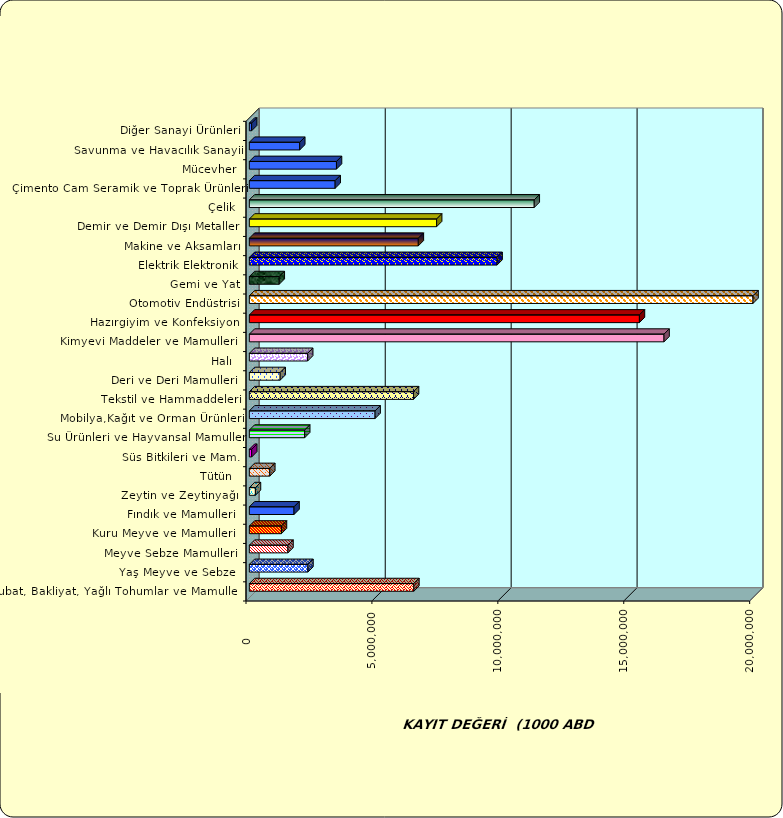
| Category | Series 0 |
|---|---|
|  Hububat, Bakliyat, Yağlı Tohumlar ve Mamulleri  | 6532204.22 |
|  Yaş Meyve ve Sebze   | 2326231.497 |
|  Meyve Sebze Mamulleri  | 1532795.071 |
|  Kuru Meyve ve Mamulleri   | 1273789.65 |
|  Fındık ve Mamulleri  | 1774006.961 |
|  Zeytin ve Zeytinyağı  | 241037.009 |
|  Tütün  | 810747.842 |
|  Süs Bitkileri ve Mam. | 93007.603 |
|  Su Ürünleri ve Hayvansal Mamuller | 2196996.661 |
|  Mobilya,Kağıt ve Orman Ürünleri | 4992845.582 |
|  Tekstil ve Hammaddeleri | 6518454.696 |
|  Deri ve Deri Mamulleri  | 1223617.715 |
|  Halı  | 2315124.205 |
|  Kimyevi Maddeler ve Mamulleri   | 16465972.782 |
|  Hazırgiyim ve Konfeksiyon  | 15488797.23 |
|  Otomotiv Endüstrisi | 22752399.023 |
|  Gemi ve Yat | 1186886.184 |
|  Elektrik Elektronik | 9836452.844 |
|  Makine ve Aksamları | 6709160.006 |
|  Demir ve Demir Dışı Metaller  | 7436218.76 |
|  Çelik | 11312574.273 |
|  Çimento Cam Seramik ve Toprak Ürünleri | 3407146.074 |
|  Mücevher | 3459793.587 |
|  Savunma ve Havacılık Sanayii | 2000036.123 |
|  Diğer Sanayi Ürünleri | 90343.275 |